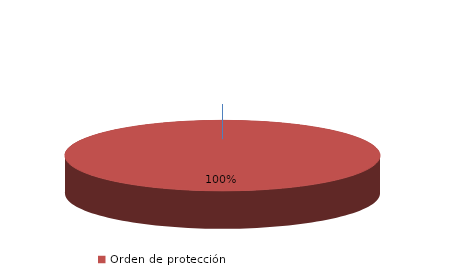
| Category | Series 0 |
|---|---|
| Orden de alejamiento | 0 |
| Orden de protección | 375 |